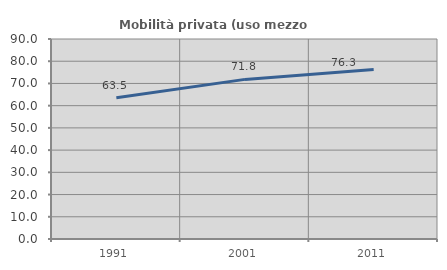
| Category | Mobilità privata (uso mezzo privato) |
|---|---|
| 1991.0 | 63.545 |
| 2001.0 | 71.825 |
| 2011.0 | 76.31 |